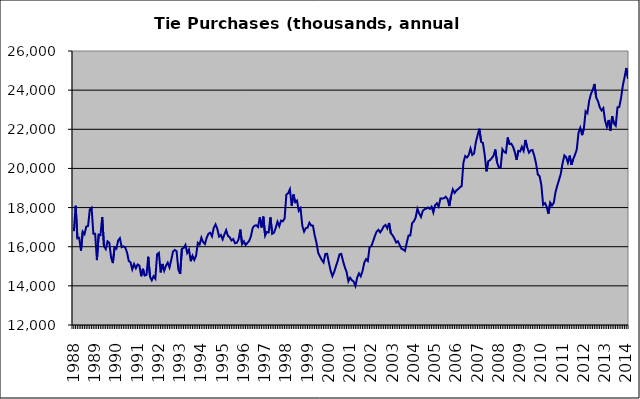
| Category | Series 0 |
|---|---|
| 1988.0 | 16794 |
| nan | 18096 |
| nan | 16425 |
| nan | 16454 |
| nan | 15802 |
| nan | 16769 |
| nan | 16644 |
| nan | 17028 |
| nan | 17057 |
| nan | 17905 |
| nan | 17995 |
| nan | 16665 |
| 1989.0 | 16665 |
| nan | 15316 |
| nan | 16619 |
| nan | 16593 |
| nan | 17519 |
| nan | 16026 |
| nan | 15879 |
| nan | 16277 |
| nan | 16203 |
| nan | 15461 |
| nan | 15163 |
| nan | 15972 |
| 1990.0 | 15899 |
| nan | 16314 |
| nan | 16434 |
| nan | 15977 |
| nan | 16020 |
| nan | 15960 |
| nan | 15711 |
| nan | 15271 |
| nan | 15199 |
| nan | 14844 |
| nan | 15113 |
| nan | 14898 |
| 1991.0 | 15092 |
| nan | 15037 |
| nan | 14492 |
| nan | 14871 |
| nan | 14530 |
| nan | 14562 |
| nan | 15485 |
| nan | 14460 |
| nan | 14286 |
| nan | 14494 |
| nan | 14368 |
| nan | 15613 |
| 1992.0 | 15687 |
| nan | 14688 |
| nan | 15120 |
| nan | 14773 |
| nan | 15028 |
| nan | 15185 |
| nan | 14940 |
| nan | 15334 |
| nan | 15756 |
| nan | 15832 |
| nan | 15770 |
| nan | 14841 |
| 1993.0 | 14611 |
| nan | 15894 |
| nan | 15935 |
| nan | 16089 |
| nan | 15681 |
| nan | 15852 |
| nan | 15260 |
| nan | 15539 |
| nan | 15326 |
| nan | 15535 |
| nan | 16195 |
| nan | 16113 |
| 1994.0 | 16461 |
| nan | 16234 |
| nan | 16139 |
| nan | 16458 |
| nan | 16663 |
| nan | 16714 |
| nan | 16533 |
| nan | 16965 |
| nan | 17141 |
| nan | 16912 |
| nan | 16518 |
| nan | 16600 |
| 1995.0 | 16377 |
| nan | 16627 |
| nan | 16845 |
| nan | 16555 |
| nan | 16483 |
| nan | 16320 |
| nan | 16392 |
| nan | 16177 |
| nan | 16200 |
| nan | 16378 |
| nan | 16874 |
| nan | 16131 |
| 1996.0 | 16274 |
| nan | 16091 |
| nan | 16194 |
| nan | 16295 |
| nan | 16540 |
| nan | 16965 |
| nan | 17074 |
| nan | 17096 |
| nan | 17004 |
| nan | 17502 |
| nan | 16988 |
| nan | 17539 |
| 1997.0 | 16566 |
| nan | 16751 |
| nan | 16730 |
| nan | 17496 |
| nan | 16659 |
| nan | 16714 |
| nan | 16966 |
| nan | 17275 |
| nan | 17050 |
| nan | 17334 |
| nan | 17299 |
| nan | 17439 |
| 1998.0 | 18664 |
| nan | 18734 |
| nan | 18936 |
| nan | 18098 |
| nan | 18667 |
| nan | 18275 |
| nan | 18355 |
| nan | 17838 |
| nan | 17966 |
| nan | 17066 |
| nan | 16772 |
| nan | 16950 |
| 1999.0 | 16977 |
| nan | 17223 |
| nan | 17085 |
| nan | 17076 |
| nan | 16579 |
| nan | 16203 |
| nan | 15678 |
| nan | 15500 |
| nan | 15324 |
| nan | 15196 |
| nan | 15627 |
| nan | 15640 |
| 2000.0 | 15186 |
| nan | 14772 |
| nan | 14494 |
| nan | 14711 |
| nan | 15001 |
| nan | 15277 |
| nan | 15608 |
| nan | 15633.6 |
| nan | 15268 |
| nan | 14952.4 |
| nan | 14714.4 |
| nan | 14235.1 |
| 2001.0 | 14412.1 |
| nan | 14288.1 |
| nan | 14220.1 |
| nan | 13991.1 |
| nan | 14425.1 |
| nan | 14636.1 |
| nan | 14486.1 |
| nan | 14755.5 |
| nan | 15180.1 |
| nan | 15366.7 |
| nan | 15270.7 |
| nan | 15981 |
| 2002.0 | 16029 |
| nan | 16278 |
| nan | 16554 |
| nan | 16772 |
| nan | 16864.779 |
| nan | 16732.143 |
| nan | 16869.773 |
| nan | 17044.272 |
| nan | 17110.816 |
| nan | 16935.357 |
| nan | 17214.632 |
| nan | 16685.945 |
| 2003.0 | 16584.762 |
| nan | 16423.965 |
| nan | 16213.153 |
| nan | 16279.62 |
| nan | 16079.803 |
| nan | 15893.929 |
| nan | 15856.449 |
| nan | 15786.375 |
| nan | 16206.63 |
| nan | 16576.807 |
| nan | 16577.258 |
| nan | 17193.927 |
| 2004.0 | 17300.698 |
| nan | 17486.896 |
| nan | 17943.35 |
| nan | 17698.616 |
| nan | 17520.808 |
| nan | 17820.038 |
| nan | 17913.671 |
| nan | 17943.361 |
| nan | 18006.259 |
| nan | 17933.267 |
| nan | 18045.705 |
| nan | 17749.231 |
| 2005.0 | 18120.293 |
| nan | 18217.964 |
| nan | 18050.513 |
| nan | 18460.353 |
| nan | 18462.346 |
| nan | 18474.613 |
| nan | 18553.183 |
| nan | 18441.251 |
| nan | 18076.596 |
| nan | 18589.667 |
| nan | 18925.778 |
| nan | 18744.891 |
| 2006.0 | 18872.122 |
| nan | 18943.051 |
| nan | 19035 |
| nan | 19096.504 |
| nan | 20301.829 |
| nan | 20633.39 |
| nan | 20558.545 |
| nan | 20688.386 |
| nan | 21013.776 |
| nan | 20688.165 |
| nan | 20761.253 |
| nan | 21332.775 |
| 2007.0 | 21704.659 |
| nan | 22029.336 |
| nan | 21356.246 |
| nan | 21304.71 |
| nan | 20700.172 |
| nan | 19851.439 |
| nan | 20360.531 |
| nan | 20422.597 |
| nan | 20527.979 |
| nan | 20652.564 |
| nan | 20966.065 |
| nan | 20301.696 |
| 2008.0 | 20054.77 |
| nan | 20037.097 |
| nan | 20977.505 |
| nan | 20844.486 |
| nan | 20798.047 |
| nan | 21580.707 |
| nan | 21241.811 |
| nan | 21264.942 |
| nan | 21111.38 |
| nan | 20841.661 |
| nan | 20439.02 |
| nan | 20896.232 |
| 2009.0 | 20863.704 |
| nan | 21104.27 |
| nan | 20898.69 |
| nan | 21455.363 |
| nan | 21078.741 |
| nan | 20806.603 |
| nan | 20920.173 |
| nan | 20941.076 |
| nan | 20648.757 |
| nan | 20256.647 |
| nan | 19692.437 |
| nan | 19604.055 |
| 2010.0 | 19148.944 |
| nan | 18142.822 |
| nan | 18231.973 |
| nan | 18042.422 |
| nan | 17685.593 |
| nan | 18253.454 |
| nan | 18107.794 |
| nan | 18239.4 |
| nan | 18788.04 |
| nan | 19124.813 |
| nan | 19421.05 |
| nan | 19735.982 |
| 2011.0 | 20267.368 |
| nan | 20662.733 |
| nan | 20573.808 |
| nan | 20287.484 |
| nan | 20655.189 |
| nan | 20185.167 |
| nan | 20475.06 |
| nan | 20700.175 |
| nan | 20969.137 |
| nan | 21828.66 |
| nan | 22076.202 |
| nan | 21699.581 |
| 2012.0 | 22034.885 |
| nan | 22917.926 |
| nan | 22823.2 |
| nan | 23452.563 |
| nan | 23806.877 |
| nan | 24003.444 |
| nan | 24316.991 |
| nan | 23613.628 |
| nan | 23434.252 |
| nan | 23117.15 |
| nan | 22963.606 |
| nan | 23081.551 |
| 2013.0 | 22435.959 |
| nan | 22122.495 |
| nan | 22476.498 |
| nan | 21929.786 |
| nan | 22666.032 |
| nan | 22295.532 |
| nan | 22180.968 |
| nan | 23119.766 |
| nan | 23138.87 |
| nan | 23588.791 |
| nan | 24231.321 |
| nan | 24664.451 |
| 2014.0 | 25131.231 |
| nan | 24577.817 |